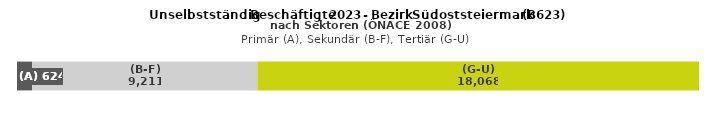
| Category | (A) | (B-F) | (G-U) |
|---|---|---|---|
| 0 | 624 | 9211 | 18068 |